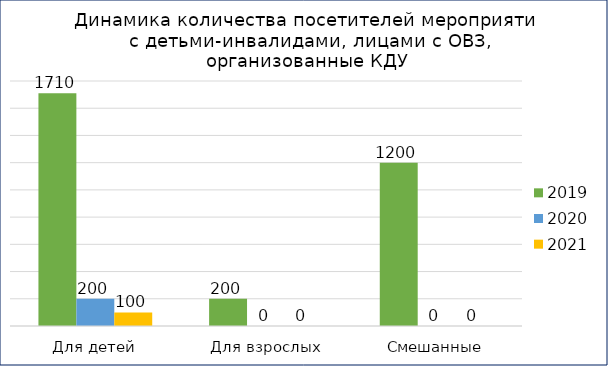
| Category | 2019 | 2020 | 2021 |
|---|---|---|---|
| Для детей | 1710 | 200 | 100 |
| Для взрослых | 200 | 0 | 0 |
| Смешанные | 1200 | 0 | 0 |